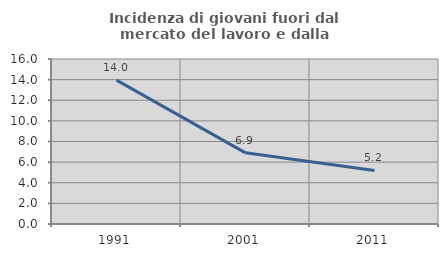
| Category | Incidenza di giovani fuori dal mercato del lavoro e dalla formazione  |
|---|---|
| 1991.0 | 13.95 |
| 2001.0 | 6.902 |
| 2011.0 | 5.192 |